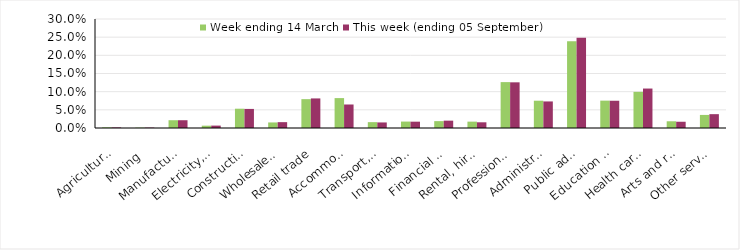
| Category | Week ending 14 March | This week (ending 05 September) |
|---|---|---|
| Agriculture, forestry and fishing | 0.002 | 0.002 |
| Mining | 0.001 | 0.001 |
| Manufacturing | 0.021 | 0.021 |
| Electricity, gas, water and waste services | 0.006 | 0.007 |
| Construction | 0.053 | 0.052 |
| Wholesale trade | 0.015 | 0.016 |
| Retail trade | 0.079 | 0.081 |
| Accommodation and food services | 0.082 | 0.065 |
| Transport, postal and warehousing | 0.016 | 0.015 |
| Information media and telecommunications | 0.018 | 0.017 |
| Financial and insurance services | 0.019 | 0.02 |
| Rental, hiring and real estate services | 0.018 | 0.016 |
| Professional, scientific and technical services | 0.126 | 0.126 |
| Administrative and support services | 0.075 | 0.073 |
| Public administration and safety | 0.239 | 0.248 |
| Education and training | 0.075 | 0.075 |
| Health care and social assistance | 0.1 | 0.109 |
| Arts and recreation services | 0.018 | 0.017 |
| Other services | 0.036 | 0.038 |